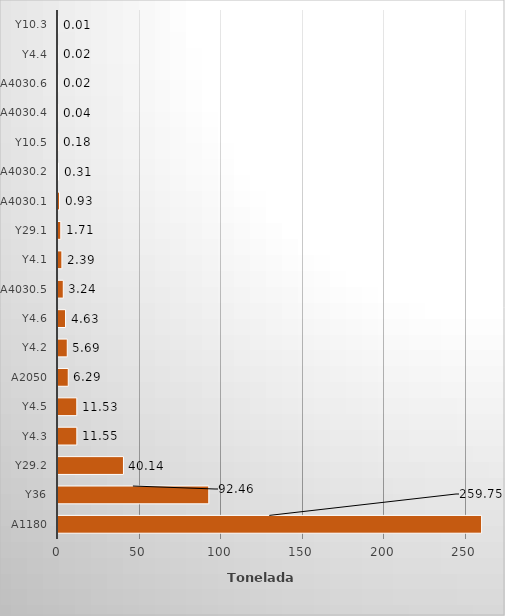
| Category | Series 0 |
|---|---|
| A1180 | 259.754 |
| Y36 | 92.461 |
| Y29.2 | 40.14 |
| Y4.3 | 11.55 |
| Y4.5 | 11.528 |
| A2050 | 6.289 |
| Y4.2 | 5.686 |
| Y4.6 | 4.63 |
| A4030.5 | 3.24 |
| Y4.1 | 2.392 |
| Y29.1 | 1.715 |
| A4030.1 | 0.934 |
| A4030.2 | 0.311 |
| Y10.5 | 0.178 |
| A4030.4 | 0.04 |
| A4030.6 | 0.015 |
| Y4.4 | 0.015 |
| Y10.3 | 0.005 |